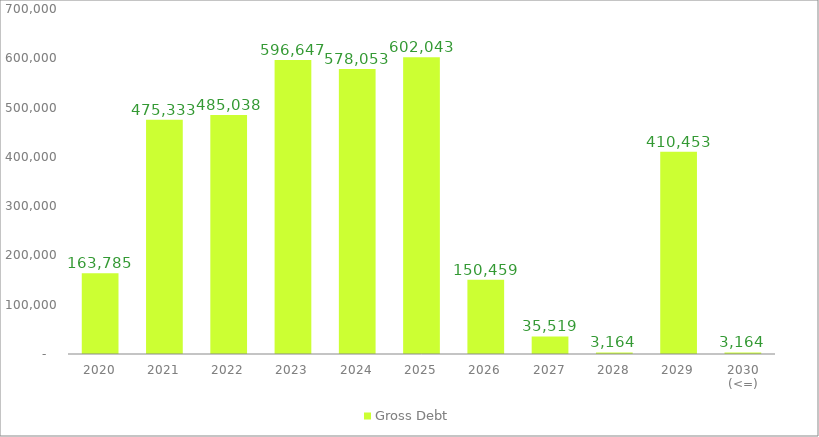
| Category | Gross Debt |
|---|---|
| 2020 | 163785.163 |
| 2021 | 475332.879 |
| 2022 | 485038.024 |
| 2023 | 596646.596 |
| 2024 | 578053.454 |
| 2025 | 602043.086 |
| 2026 | 150459.346 |
| 2027 | 35519.065 |
| 2028 | 3164.108 |
| 2029 | 410452.808 |
| 2030 (<=) | 3164.108 |